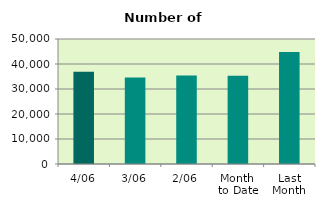
| Category | Series 0 |
|---|---|
| 4/06 | 36948 |
| 3/06 | 34632 |
| 2/06 | 35396 |
| Month 
to Date | 35306 |
| Last
Month | 44751.81 |